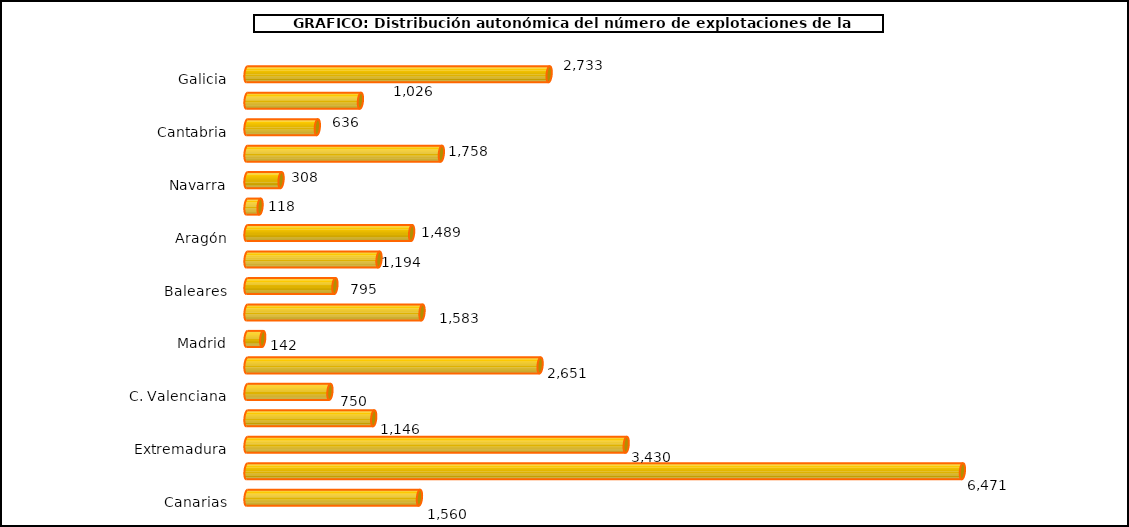
| Category | num. Explotaciones |
|---|---|
|   Galicia | 2733 |
|   P. de Asturias | 1026 |
|   Cantabria | 636 |
|   País Vasco | 1758 |
|   Navarra | 308 |
|   La Rioja | 118 |
|   Aragón | 1489 |
|   Cataluña | 1194 |
|   Baleares | 795 |
|   Castilla y León | 1583 |
|   Madrid | 142 |
|   Castilla – La Mancha | 2651 |
|   C. Valenciana | 750 |
|   R. de Murcia | 1146 |
|   Extremadura | 3430 |
|   Andalucía | 6471 |
|   Canarias | 1560 |